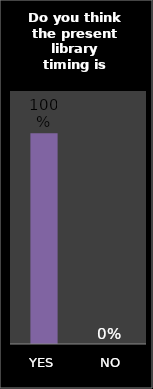
| Category | Series 0 |
|---|---|
| YES | 1 |
| NO | 0 |